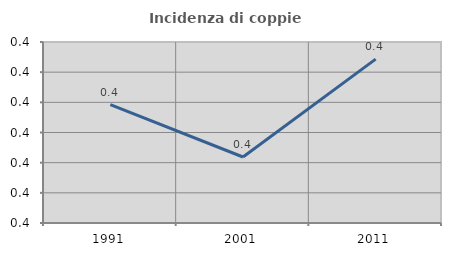
| Category | Incidenza di coppie miste |
|---|---|
| 1991.0 | 0.385 |
| 2001.0 | 0.376 |
| 2011.0 | 0.392 |